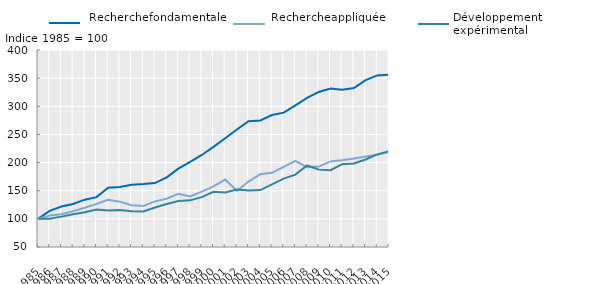
| Category | Recherche fondamentale | Recherche appliquée | Développement expérimental |
|---|---|---|---|
| 1985.0 | 100 | 100 | 100 |
| 1986.0 | 114.111 | 105.856 | 100.005 |
| 1987.0 | 121.937 | 108.198 | 103.95 |
| 1988.0 | 126.473 | 113.591 | 108.004 |
| 1989.0 | 134.1 | 119.808 | 111.648 |
| 1990.0 | 138.599 | 126.592 | 116.401 |
| 1991.0 | 155.106 | 133.936 | 114.644 |
| 1992.0 | 156.749 | 130.55 | 115.844 |
| 1993.0 | 160.56 | 124.348 | 113.325 |
| 1994.0 | 161.721 | 122.681 | 113.249 |
| 1995.0 | 163.6 | 130.935 | 120.225 |
| 1996.0 | 173.879 | 135.989 | 126.311 |
| 1997.0 | 189.089 | 144.616 | 131.834 |
| 1998.0 | 201.085 | 139.693 | 132.88 |
| 1999.0 | 213.483 | 148.323 | 138.553 |
| 2000.0 | 227.883 | 157.656 | 147.957 |
| 2001.0 | 243.191 | 169.889 | 147.042 |
| 2002.0 | 258.828 | 149.914 | 152.199 |
| 2003.0 | 273.326 | 166.277 | 150.425 |
| 2004.0 | 274.934 | 179.459 | 151.208 |
| 2005.0 | 284.521 | 181.883 | 161.251 |
| 2006.0 | 288.683 | 192.328 | 171.433 |
| 2007.0 | 301.632 | 203.124 | 178.609 |
| 2008.0 | 314.795 | 191.885 | 194.885 |
| 2009.0 | 325.501 | 192.906 | 187.47 |
| 2010.0 | 331.697 | 202.051 | 186.479 |
| 2011.0 | 329.526 | 204.167 | 197.215 |
| 2012.0 | 332.467 | 207.402 | 198.49 |
| 2013.0 | 346.529 | 210.693 | 205.494 |
| 2014.0 | 354.848 | 213.773 | 214.653 |
| 2015.0 | 356.178 | 218.576 | 220.201 |